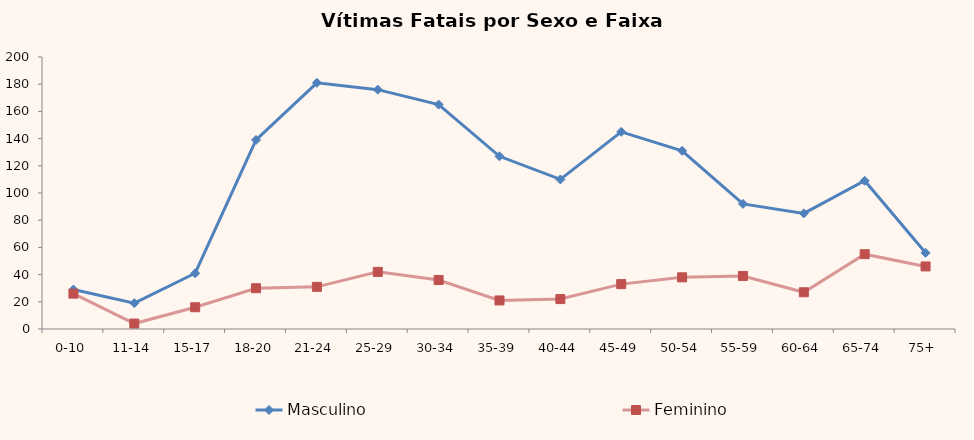
| Category | Masculino | Feminino |
|---|---|---|
| 0-10 | 29 | 26 |
| 11-14 | 19 | 4 |
| 15-17 | 41 | 16 |
| 18-20 | 139 | 30 |
| 21-24 | 181 | 31 |
| 25-29 | 176 | 42 |
| 30-34 | 165 | 36 |
| 35-39 | 127 | 21 |
| 40-44 | 110 | 22 |
| 45-49 | 145 | 33 |
| 50-54 | 131 | 38 |
| 55-59 | 92 | 39 |
| 60-64 | 85 | 27 |
| 65-74 | 109 | 55 |
| 75+ | 56 | 46 |